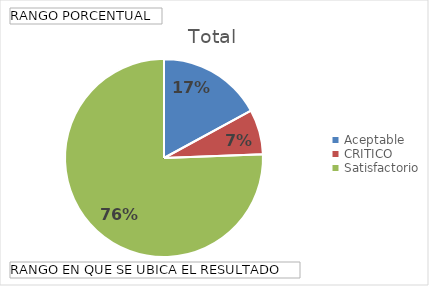
| Category | Total |
|---|---|
| Aceptable | 0.171 |
| CRITICO | 0.073 |
| Satisfactorio | 0.756 |